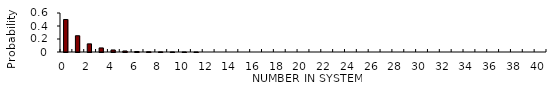
| Category | Series 0 |
|---|---|
| 0.0 | 0.5 |
| 1.0 | 0.25 |
| 2.0 | 0.125 |
| 3.0 | 0.063 |
| 4.0 | 0.031 |
| 5.0 | 0.016 |
| 6.0 | 0.008 |
| 7.0 | 0.004 |
| 8.0 | 0.002 |
| 9.0 | 0.001 |
| 10.0 | 0 |
| 11.0 | 0 |
| 12.0 | 0 |
| 13.0 | 0 |
| 14.0 | 0 |
| 15.0 | 0 |
| 16.0 | 0 |
| 17.0 | 0 |
| 18.0 | 0 |
| 19.0 | 0 |
| 20.0 | 0 |
| 21.0 | 0 |
| 22.0 | 0 |
| 23.0 | 0 |
| 24.0 | 0 |
| 25.0 | 0 |
| 26.0 | 0 |
| 27.0 | 0 |
| 28.0 | 0 |
| 29.0 | 0 |
| 30.0 | 0 |
| 31.0 | 0 |
| 32.0 | 0 |
| 33.0 | 0 |
| 34.0 | 0 |
| 35.0 | 0 |
| 36.0 | 0 |
| 37.0 | 0 |
| 38.0 | 0 |
| 39.0 | 0 |
| 40.0 | 0 |